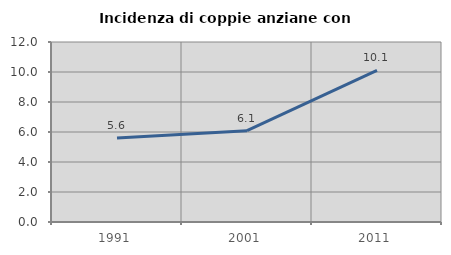
| Category | Incidenza di coppie anziane con figli |
|---|---|
| 1991.0 | 5.6 |
| 2001.0 | 6.087 |
| 2011.0 | 10.101 |